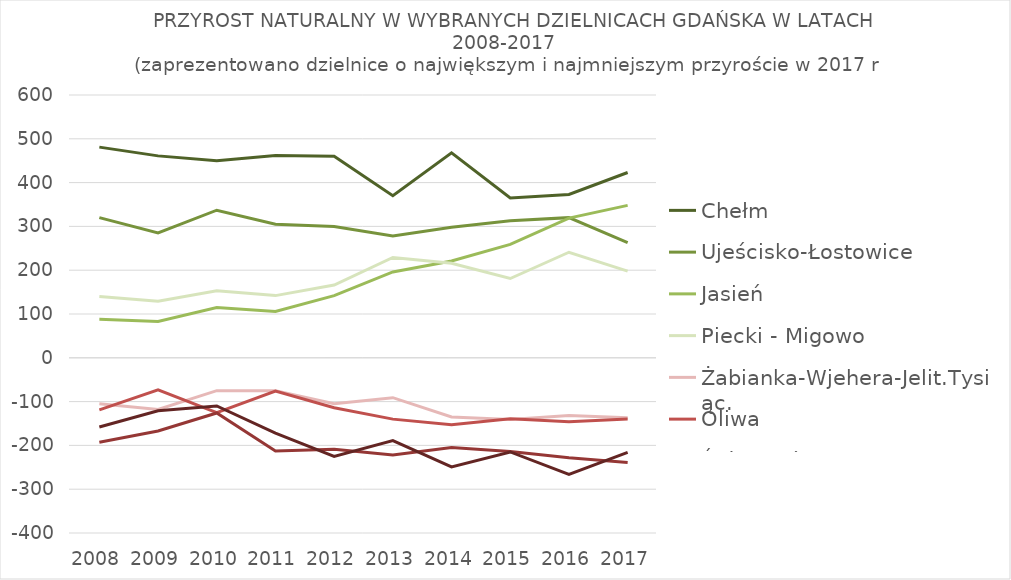
| Category | Chełm | Ujeścisko-Łostowice | Jasień | Piecki - Migowo | Żabianka-Wjehera-Jelit.Tysiąc. | Oliwa | Śródmieście | Przymorze Wielkie |
|---|---|---|---|---|---|---|---|---|
| 2008.0 | 481 | 320 | 88 | 140 | -105 | -119 | -193 | -158 |
| 2009.0 | 461 | 285 | 83 | 129 | -118 | -73 | -167 | -121 |
| 2010.0 | 450 | 337 | 115 | 153 | -75 | -125 | -126 | -110 |
| 2011.0 | 462 | 305 | 106 | 142 | -75 | -76 | -213 | -172 |
| 2012.0 | 460 | 300 | 142 | 166 | -105 | -114 | -209 | -225 |
| 2013.0 | 370 | 278 | 196 | 229 | -91 | -140 | -222 | -189 |
| 2014.0 | 468 | 298 | 221 | 216 | -135 | -153 | -205 | -249 |
| 2015.0 | 365 | 313 | 259 | 181 | -141 | -139 | -214 | -215 |
| 2016.0 | 373 | 320 | 319 | 241 | -132 | -146 | -228 | -266 |
| 2017.0 | 423 | 263 | 348 | 198 | -137 | -140 | -239 | -216 |